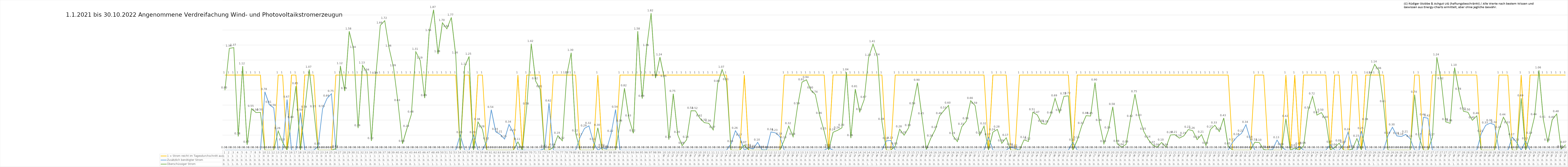
| Category | 1 = Strom reicht im Tagesdurchschnitt aus | Zusätzlich benötigter Strom | Überschüssiger Strom |
|---|---|---|---|
| 0 | 1 | 0 | 0.798 |
| 1 | 1 | 0 | 1.356 |
| 2 | 1 | 0 | 1.366 |
| 3 | 1 | 0 | 0.184 |
| 4 | 1 | 0 | 1.118 |
| 5 | 1 | 0 | 0.073 |
| 6 | 1 | 0 | 0.553 |
| 7 | 1 | 0 | 0.501 |
| 8 | 1 | 0 | 0.503 |
| 9 | 0 | 0.777 | 0 |
| 10 | 0 | 0.606 | 0 |
| 11 | 0 | 0.563 | 0 |
| 12 | 1 | 0 | 0.255 |
| 13 | 1 | 0 | 0.104 |
| 14 | 0 | 0.673 | 0 |
| 15 | 1 | 0 | 0.405 |
| 16 | 1 | 0 | 0.852 |
| 17 | 0 | 0.502 | 0 |
| 18 | 1 | 0 | 0.54 |
| 19 | 1 | 0 | 1.074 |
| 20 | 1 | 0 | 0.546 |
| 21 | 0 | 0.048 | 0 |
| 22 | 0 | 0.55 | 0 |
| 23 | 0 | 0.688 | 0 |
| 24 | 0 | 0.751 | 0 |
| 25 | 1 | 0 | 0.018 |
| 26 | 1 | 0 | 1.121 |
| 27 | 1 | 0 | 0.788 |
| 28 | 1 | 0 | 1.583 |
| 29 | 1 | 0 | 1.338 |
| 30 | 1 | 0 | 0.293 |
| 31 | 1 | 0 | 1.13 |
| 32 | 1 | 0 | 1.037 |
| 33 | 1 | 0 | 0.123 |
| 34 | 1 | 0 | 0.992 |
| 35 | 1 | 0 | 1.662 |
| 36 | 1 | 0 | 1.724 |
| 37 | 1 | 0 | 1.355 |
| 38 | 1 | 0 | 1.094 |
| 39 | 1 | 0 | 0.628 |
| 40 | 1 | 0 | 0.085 |
| 41 | 1 | 0 | 0.286 |
| 42 | 1 | 0 | 0.476 |
| 43 | 1 | 0 | 1.311 |
| 44 | 1 | 0 | 1.194 |
| 45 | 1 | 0 | 0.694 |
| 46 | 1 | 0 | 1.563 |
| 47 | 1 | 0 | 1.87 |
| 48 | 1 | 0 | 1.28 |
| 49 | 1 | 0 | 1.697 |
| 50 | 1 | 0 | 1.616 |
| 51 | 1 | 0 | 1.767 |
| 52 | 1 | 0 | 1.264 |
| 53 | 0 | 0.202 | 0 |
| 54 | 1 | 0 | 1.112 |
| 55 | 1 | 0 | 1.247 |
| 56 | 0 | 0.202 | 0 |
| 57 | 1 | 0 | 0.376 |
| 58 | 1 | 0 | 0.278 |
| 59 | 0 | 0.118 | 0 |
| 60 | 0 | 0.538 | 0 |
| 61 | 0 | 0.244 | 0 |
| 62 | 0 | 0.209 | 0 |
| 63 | 0 | 0.147 | 0 |
| 64 | 0 | 0.341 | 0 |
| 65 | 0 | 0.231 | 0 |
| 66 | 1 | 0 | 0.11 |
| 67 | 0 | 0.003 | 0 |
| 68 | 1 | 0 | 0.584 |
| 69 | 1 | 0 | 1.417 |
| 70 | 1 | 0 | 0.92 |
| 71 | 1 | 0 | 0.813 |
| 72 | 0 | 0.019 | 0 |
| 73 | 0 | 0.624 | 0 |
| 74 | 1 | 0 | 0.038 |
| 75 | 1 | 0 | 0.193 |
| 76 | 1 | 0 | 0.125 |
| 77 | 1 | 0 | 0.999 |
| 78 | 1 | 0 | 1.297 |
| 79 | 1 | 0 | 0.224 |
| 80 | 0 | 0.171 | 0 |
| 81 | 0 | 0.289 | 0 |
| 82 | 0 | 0.323 | 0 |
| 83 | 0 | 0.11 | 0 |
| 84 | 1 | 0 | 0.298 |
| 85 | 0 | 0.032 | 0 |
| 86 | 0 | 0.013 | 0 |
| 87 | 0 | 0.22 | 0 |
| 88 | 0 | 0.541 | 0 |
| 89 | 1 | 0 | 0.357 |
| 90 | 1 | 0 | 0.825 |
| 91 | 1 | 0 | 0.425 |
| 92 | 1 | 0 | 0.225 |
| 93 | 1 | 0 | 1.583 |
| 94 | 1 | 0 | 0.686 |
| 95 | 1 | 0 | 1.361 |
| 96 | 1 | 0 | 1.824 |
| 97 | 1 | 0 | 0.96 |
| 98 | 1 | 0 | 1.239 |
| 99 | 1 | 0 | 0.951 |
| 100 | 1 | 0 | 0.14 |
| 101 | 1 | 0 | 0.751 |
| 102 | 1 | 0 | 0.205 |
| 103 | 1 | 0 | 0.06 |
| 104 | 1 | 0 | 0.138 |
| 105 | 1 | 0 | 0.525 |
| 106 | 1 | 0 | 0.524 |
| 107 | 1 | 0 | 0.425 |
| 108 | 1 | 0 | 0.366 |
| 109 | 1 | 0 | 0.357 |
| 110 | 1 | 0 | 0.269 |
| 111 | 1 | 0 | 0.884 |
| 112 | 1 | 0 | 1.074 |
| 113 | 1 | 0 | 0.908 |
| 114 | 0 | 0.082 | 0 |
| 115 | 0 | 0.258 | 0 |
| 116 | 0 | 0.168 | 0 |
| 117 | 1 | 0 | 0.068 |
| 118 | 0 | 0.031 | 0 |
| 119 | 0 | 0.016 | 0 |
| 120 | 0 | 0.104 | 0 |
| 121 | 0 | 0.005 | 0 |
| 122 | 0 | 0.003 | 0 |
| 123 | 0 | 0.242 | 0 |
| 124 | 0 | 0.23 | 0 |
| 125 | 0 | 0.181 | 0 |
| 126 | 1 | 0 | 0.134 |
| 127 | 1 | 0 | 0.321 |
| 128 | 1 | 0 | 0.178 |
| 129 | 1 | 0 | 0.585 |
| 130 | 1 | 0 | 0.906 |
| 131 | 1 | 0 | 0.937 |
| 132 | 1 | 0 | 0.798 |
| 133 | 1 | 0 | 0.741 |
| 134 | 1 | 0 | 0.458 |
| 135 | 1 | 0 | 0.25 |
| 136 | 0 | 0.03 | 0 |
| 137 | 1 | 0 | 0.238 |
| 138 | 1 | 0 | 0.263 |
| 139 | 1 | 0 | 0.298 |
| 140 | 1 | 0 | 1.04 |
| 141 | 1 | 0 | 0.161 |
| 142 | 1 | 0 | 0.812 |
| 143 | 1 | 0 | 0.509 |
| 144 | 1 | 0 | 0.672 |
| 145 | 1 | 0 | 1.232 |
| 146 | 1 | 0 | 1.413 |
| 147 | 1 | 0 | 1.238 |
| 148 | 1 | 0 | 0.379 |
| 149 | 0 | 0.123 | 0 |
| 150 | 0 | 0.129 | 0 |
| 151 | 1 | 0 | 0.052 |
| 152 | 1 | 0 | 0.279 |
| 153 | 1 | 0 | 0.199 |
| 154 | 1 | 0 | 0.296 |
| 155 | 1 | 0 | 0.585 |
| 156 | 1 | 0 | 0.899 |
| 157 | 1 | 0 | 0.452 |
| 158 | 1 | 0 | 0.009 |
| 159 | 1 | 0 | 0.156 |
| 160 | 1 | 0 | 0.272 |
| 161 | 1 | 0 | 0.456 |
| 162 | 1 | 0 | 0.528 |
| 163 | 1 | 0 | 0.595 |
| 164 | 1 | 0 | 0.191 |
| 165 | 1 | 0 | 0.114 |
| 166 | 1 | 0 | 0.312 |
| 167 | 1 | 0 | 0.386 |
| 168 | 1 | 0 | 0.659 |
| 169 | 1 | 0 | 0.592 |
| 170 | 1 | 0 | 0.196 |
| 171 | 1 | 0 | 0.32 |
| 172 | 0 | 0.174 | 0 |
| 173 | 1 | 0 | 0.24 |
| 174 | 1 | 0 | 0.276 |
| 175 | 1 | 0 | 0.09 |
| 176 | 1 | 0 | 0.165 |
| 177 | 0 | 0.041 | 0 |
| 178 | 0 | 0.023 | 0 |
| 179 | 1 | 0 | 0 |
| 180 | 1 | 0 | 0.136 |
| 181 | 1 | 0 | 0.116 |
| 182 | 1 | 0 | 0.505 |
| 183 | 1 | 0 | 0.468 |
| 184 | 1 | 0 | 0.354 |
| 185 | 1 | 0 | 0.345 |
| 186 | 1 | 0 | 0.464 |
| 187 | 1 | 0 | 0.69 |
| 188 | 1 | 0 | 0.498 |
| 189 | 1 | 0 | 0.717 |
| 190 | 1 | 0 | 0.723 |
| 191 | 0 | 0.104 | 0 |
| 192 | 1 | 0 | 0.132 |
| 193 | 1 | 0 | 0.323 |
| 194 | 1 | 0 | 0.459 |
| 195 | 1 | 0 | 0.454 |
| 196 | 1 | 0 | 0.901 |
| 197 | 1 | 0 | 0.364 |
| 198 | 1 | 0 | 0.084 |
| 199 | 1 | 0 | 0.264 |
| 200 | 1 | 0 | 0.577 |
| 201 | 1 | 0 | 0.085 |
| 202 | 1 | 0 | 0.039 |
| 203 | 1 | 0 | 0.077 |
| 204 | 1 | 0 | 0.418 |
| 205 | 1 | 0 | 0.746 |
| 206 | 1 | 0 | 0.431 |
| 207 | 1 | 0 | 0.247 |
| 208 | 1 | 0 | 0.142 |
| 209 | 1 | 0 | 0.068 |
| 210 | 1 | 0 | 0.037 |
| 211 | 1 | 0 | 0.102 |
| 212 | 1 | 0 | 0.038 |
| 213 | 1 | 0 | 0.202 |
| 214 | 1 | 0 | 0.206 |
| 215 | 1 | 0 | 0.16 |
| 216 | 1 | 0 | 0.19 |
| 217 | 1 | 0 | 0.274 |
| 218 | 1 | 0 | 0.26 |
| 219 | 1 | 0 | 0.14 |
| 220 | 1 | 0 | 0.206 |
| 221 | 1 | 0 | 0.061 |
| 222 | 1 | 0 | 0.275 |
| 223 | 1 | 0 | 0.331 |
| 224 | 1 | 0 | 0.247 |
| 225 | 1 | 0 | 0.427 |
| 226 | 1 | 0 | 0.051 |
| 227 | 0 | 0.105 | 0 |
| 228 | 0 | 0.177 | 0 |
| 229 | 0 | 0.223 | 0 |
| 230 | 0 | 0.339 | 0 |
| 231 | 0 | 0.139 | 0 |
| 232 | 1 | 0 | 0.105 |
| 233 | 1 | 0 | 0.1 |
| 234 | 1 | 0 | 0.009 |
| 235 | 0 | 0.004 | 0 |
| 236 | 0 | 0.007 | 0 |
| 237 | 0 | 0.133 | 0 |
| 238 | 0 | 0.044 | 0 |
| 239 | 1 | 0 | 0.418 |
| 240 | 0 | 0.001 | 0 |
| 241 | 1 | 0 | 0.028 |
| 242 | 0 | 0.05 | 0 |
| 243 | 1 | 0 | 0.059 |
| 244 | 1 | 0 | 0.528 |
| 245 | 1 | 0 | 0.716 |
| 246 | 1 | 0 | 0.467 |
| 247 | 1 | 0 | 0.5 |
| 248 | 1 | 0 | 0.404 |
| 249 | 0 | 0.074 | 0 |
| 250 | 1 | 0 | 0.037 |
| 251 | 1 | 0 | 0.092 |
| 252 | 0 | 0.073 | 0 |
| 253 | 0 | 0.24 | 0 |
| 254 | 1 | 0 | 0.014 |
| 255 | 1 | 0 | 0.154 |
| 256 | 0 | 0.255 | 0 |
| 257 | 1 | 0 | 0.376 |
| 258 | 1 | 0 | 0.994 |
| 259 | 1 | 0 | 1.143 |
| 260 | 1 | 0 | 1.055 |
| 261 | 1 | 0 | 0.613 |
| 262 | 0 | 0.194 | 0 |
| 263 | 0 | 0.304 | 0 |
| 264 | 0 | 0.19 | 0 |
| 265 | 0 | 0.18 | 0 |
| 266 | 0 | 0.209 | 0 |
| 267 | 0 | 0.152 | 0 |
| 268 | 1 | 0 | 0.738 |
| 269 | 1 | 0 | 0.175 |
| 270 | 0 | 0.438 | 0 |
| 271 | 0 | 0.424 | 0 |
| 272 | 1 | 0 | 0.17 |
| 273 | 1 | 0 | 1.237 |
| 274 | 1 | 0 | 0.92 |
| 275 | 1 | 0 | 0.377 |
| 276 | 1 | 0 | 0.358 |
| 277 | 1 | 0 | 1.098 |
| 278 | 1 | 0 | 0.778 |
| 279 | 1 | 0 | 0.518 |
| 280 | 1 | 0 | 0.504 |
| 281 | 1 | 0 | 0.397 |
| 282 | 1 | 0 | 0.456 |
| 283 | 0 | 0.219 | 0 |
| 284 | 0 | 0.33 | 0 |
| 285 | 0 | 0.36 | 0 |
| 286 | 0 | 0.337 | 0 |
| 287 | 1 | 0 | 0.271 |
| 288 | 1 | 0 | 0.438 |
| 289 | 1 | 0 | 0.332 |
| 290 | 0 | 0.173 | 0 |
| 291 | 0 | 0.102 | 0 |
| 292 | 1 | 0 | 0.69 |
| 293 | 0 | 0.12 | 0 |
| 294 | 1 | 0 | 0.192 |
| 295 | 1 | 0 | 0.441 |
| 296 | 1 | 0 | 1.063 |
| 297 | 1 | 0 | 0.407 |
| 298 | 1 | 0 | 0.104 |
| 299 | 1 | 0 | 0.405 |
| 300 | 1 | 0 | 0.481 |
| 301 | 1 | 0 | 0.015 |
| 302 | 1 | 0 | 0.072 |